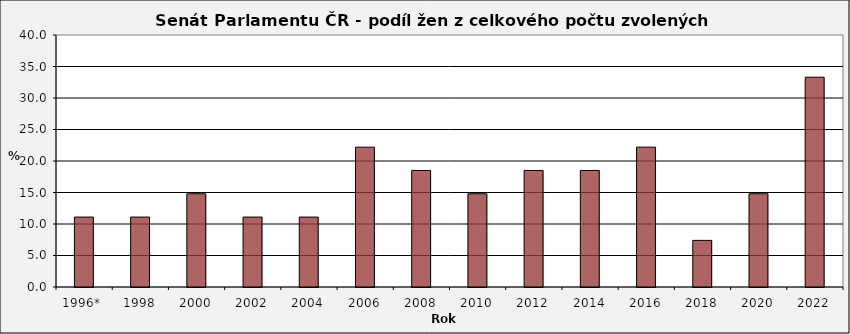
| Category | Series 0 |
|---|---|
| 1996*  | 11.1 |
| 1998 | 11.1 |
| 2000 | 14.8 |
| 2002 | 11.1 |
| 2004 | 11.1 |
| 2006 | 22.2 |
| 2008 | 18.5 |
| 2010 | 14.8 |
| 2012 | 18.5 |
| 2014 | 18.5 |
| 2016 | 22.2 |
| 2018 | 7.4 |
| 2020 | 14.8 |
| 2022 | 33.3 |